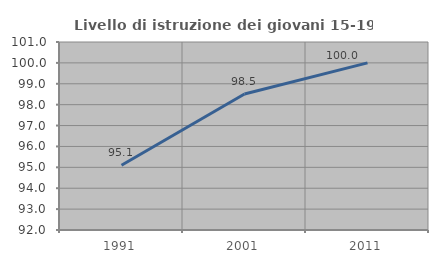
| Category | Livello di istruzione dei giovani 15-19 anni |
|---|---|
| 1991.0 | 95.098 |
| 2001.0 | 98.507 |
| 2011.0 | 100 |